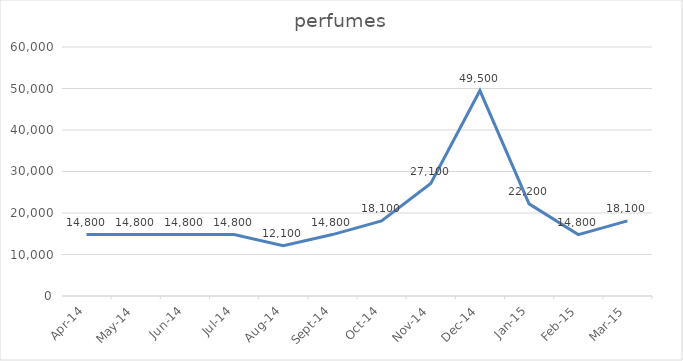
| Category | perfumes |
|---|---|
| 2014-04-01 | 14800 |
| 2014-05-01 | 14800 |
| 2014-06-01 | 14800 |
| 2014-07-01 | 14800 |
| 2014-08-01 | 12100 |
| 2014-09-01 | 14800 |
| 2014-10-01 | 18100 |
| 2014-11-01 | 27100 |
| 2014-12-01 | 49500 |
| 2015-01-01 | 22200 |
| 2015-02-01 | 14800 |
| 2015-03-01 | 18100 |